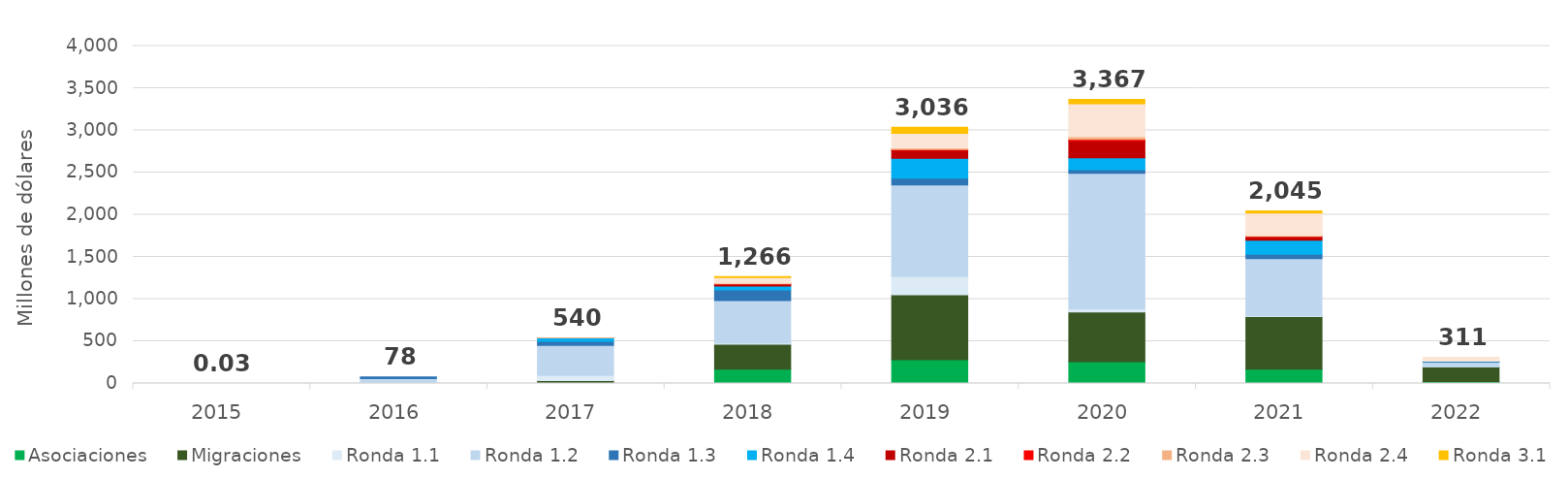
| Category | Asociaciones | Migraciones | Ronda 1.1 | Ronda 1.2 | Ronda 1.3 | Ronda 1.4 | Ronda 2.1 | Ronda 2.2 | Ronda 2.3 | Ronda 2.4 | Ronda 3.1 |
|---|---|---|---|---|---|---|---|---|---|---|---|
| 2015.0 | 0 | 0 | 0.023 | 0.003 | 0 | 0 | 0 | 0 | 0 | 0 | 0 |
| 2016.0 | 0 | 0 | 7.936 | 50.902 | 19.085 | 0 | 0 | 0 | 0 | 0 | 0 |
| 2017.0 | 1.551 | 32.93 | 60.276 | 356.292 | 49.062 | 38.707 | 0.93 | 0 | 0.096 | 0 | 0 |
| 2018.0 | 168.66 | 295.724 | 16.154 | 501.142 | 126.084 | 47.616 | 24.075 | 1.091 | 9.662 | 66.299 | 9.669 |
| 2019.0 | 280.617 | 772.208 | 213.486 | 1086.442 | 82.07 | 235.595 | 92.887 | 9.67 | 17.942 | 175.703 | 69.349 |
| 2020.0 | 258.021 | 590.016 | 33.998 | 1610.735 | 43.009 | 140.295 | 200.372 | 18.149 | 30.336 | 391.695 | 49.906 |
| 2021.0 | 169.637 | 624.814 | 8.483 | 677.28 | 51.023 | 167.952 | 40.422 | 3.959 | 8.149 | 268.135 | 25.316 |
| 2022.0 | 20.071 | 174.295 | 0 | 58.112 | 9.618 | 2.497 | 0 | 0 | 0.035 | 46.621 | 0 |